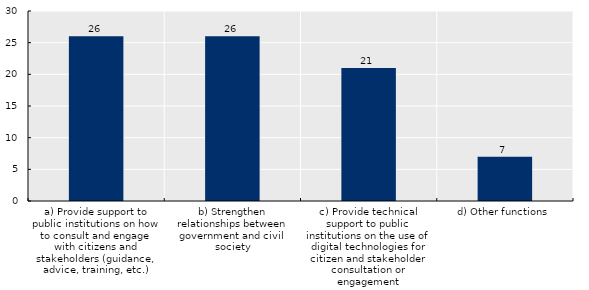
| Category | Series 0 |
|---|---|
| a) Provide support to public institutions on how to consult and engage with citizens and stakeholders (guidance, advice, training, etc.) | 26 |
| b) Strengthen relationships between government and civil society | 26 |
| c) Provide technical support to public institutions on the use of digital technologies for citizen and stakeholder consultation or engagement | 21 |
| d) Other functions | 7 |